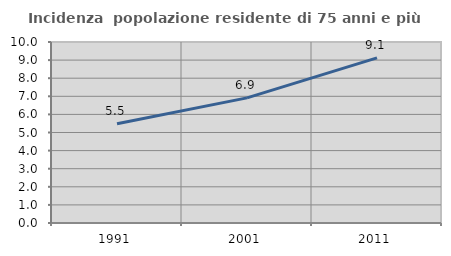
| Category | Incidenza  popolazione residente di 75 anni e più |
|---|---|
| 1991.0 | 5.479 |
| 2001.0 | 6.914 |
| 2011.0 | 9.124 |